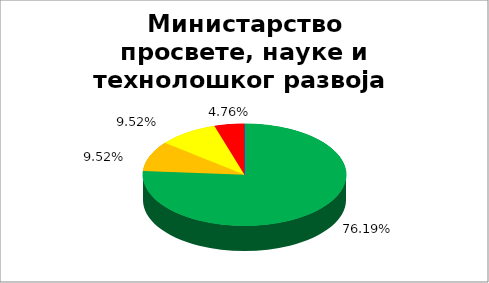
| Category | Министарство просвете, науке и технолошког развоја  |
|---|---|
| 0 | 0.762 |
| 1 | 0.095 |
| 2 | 0.095 |
| 3 | 0.048 |
| 4 | 0 |